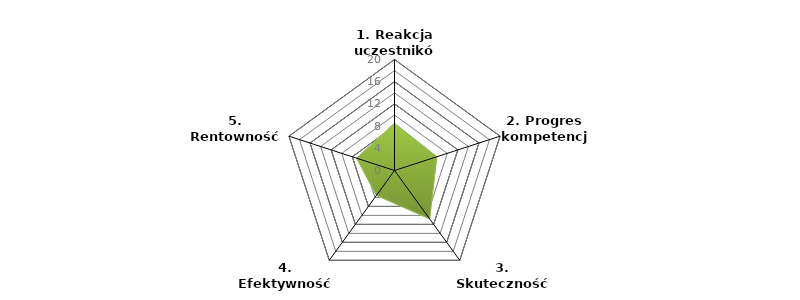
| Category | Series 0 | BENCHMARK | Series 2 |
|---|---|---|---|
| 1. Reakcja uczestników |  | 8.5 |  |
| 2. Progres kompetencji |  | 8 |  |
| 3. Skuteczność wdrożenia |  | 10.767 |  |
| 4. Efektywność biznesowa |  | 5.533 |  |
| 5. Rentowność szkolenia |  | 7.167 |  |